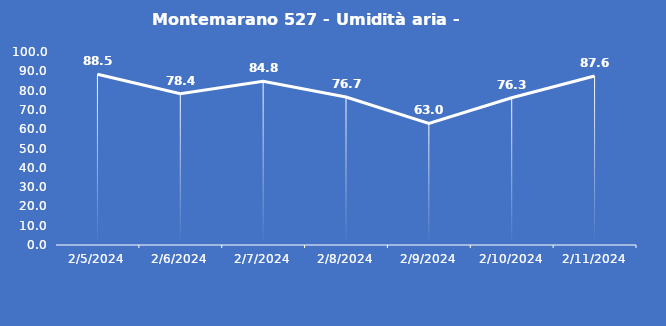
| Category | Montemarano 527 - Umidità aria - Grezzo (%) |
|---|---|
| 2/5/24 | 88.5 |
| 2/6/24 | 78.4 |
| 2/7/24 | 84.8 |
| 2/8/24 | 76.7 |
| 2/9/24 | 63 |
| 2/10/24 | 76.3 |
| 2/11/24 | 87.6 |